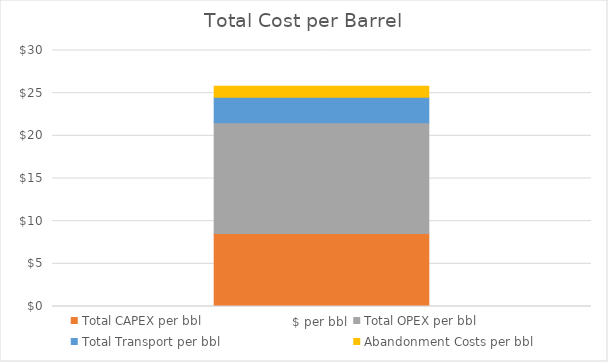
| Category | Total CAPEX per bbl | Total OPEX per bbl | Total Transport per bbl | Abandonment Costs per bbl |
|---|---|---|---|---|
| $ per bbl | 8.557 | 12.978 | 3 | 1.268 |